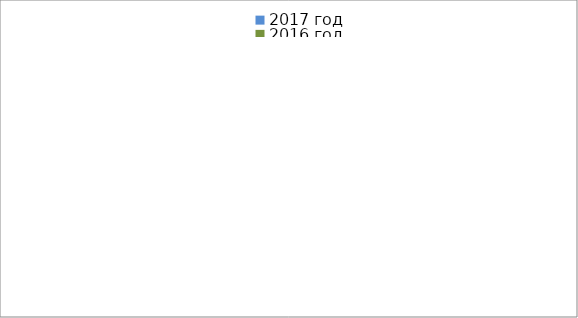
| Category | 2017 год | 2016 год |
|---|---|---|
|  - поджог | 14 | 34 |
|  - неосторожное обращение с огнём | 5 | 22 |
|  - НПТЭ электрооборудования | 14 | 17 |
|  - НПУ и Э печей | 39 | 31 |
|  - НПУ и Э транспортных средств | 43 | 24 |
|   -Шалость с огнем детей | 3 | 5 |
|  -НППБ при эксплуатации эл.приборов | 21 | 9 |
|  - курение | 29 | 14 |
| - прочие | 64 | 68 |
| - не установленные причины | 0 | 11 |